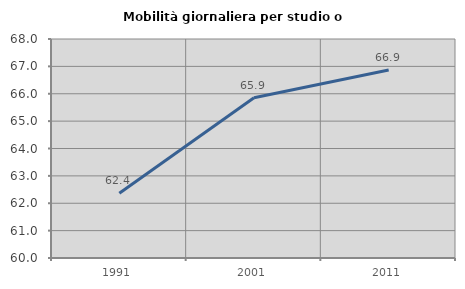
| Category | Mobilità giornaliera per studio o lavoro |
|---|---|
| 1991.0 | 62.365 |
| 2001.0 | 65.855 |
| 2011.0 | 66.865 |